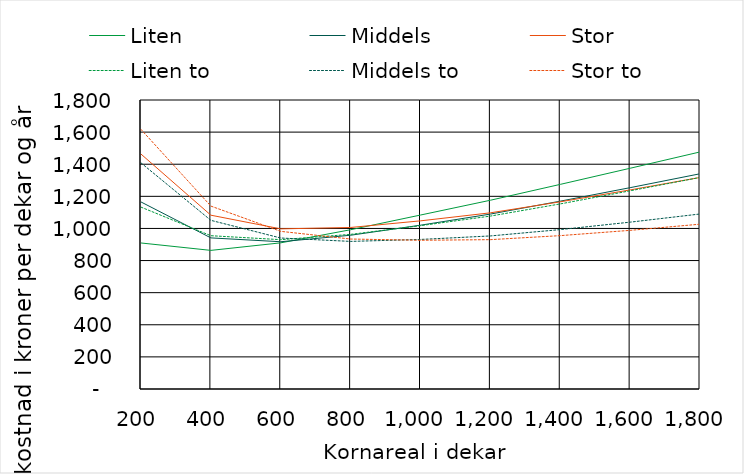
| Category | Liten | Middels | Stor | Liten to | Middels to | Stor to |
|---|---|---|---|---|---|---|
| 200.0 | 909.485 | 1164.915 | 1463.143 | 1132.814 | 1408.36 | 1616.682 |
| 400.0 | 863.387 | 941.134 | 1082.502 | 954.765 | 1050.469 | 1139.248 |
| 600.0 | 910.368 | 917.192 | 997.4 | 930.122 | 940.426 | 981.865 |
| 800.0 | 992 | 957.72 | 1005.996 | 963.075 | 919.321 | 934.045 |
| 1000.0 | 1083.477 | 1020.253 | 1047.258 | 1017.273 | 931.461 | 926.424 |
| 1200.0 | 1175.644 | 1089.395 | 1097.323 | 1076.987 | 953.32 | 930.191 |
| 1400.0 | 1274.422 | 1169.93 | 1165.843 | 1152.783 | 992.848 | 955.17 |
| 1600.0 | 1374.896 | 1254.02 | 1239.95 | 1234.465 | 1039.131 | 988.152 |
| 1800.0 | 1476.476 | 1340.475 | 1317.526 | 1317.599 | 1090.007 | 1026.564 |